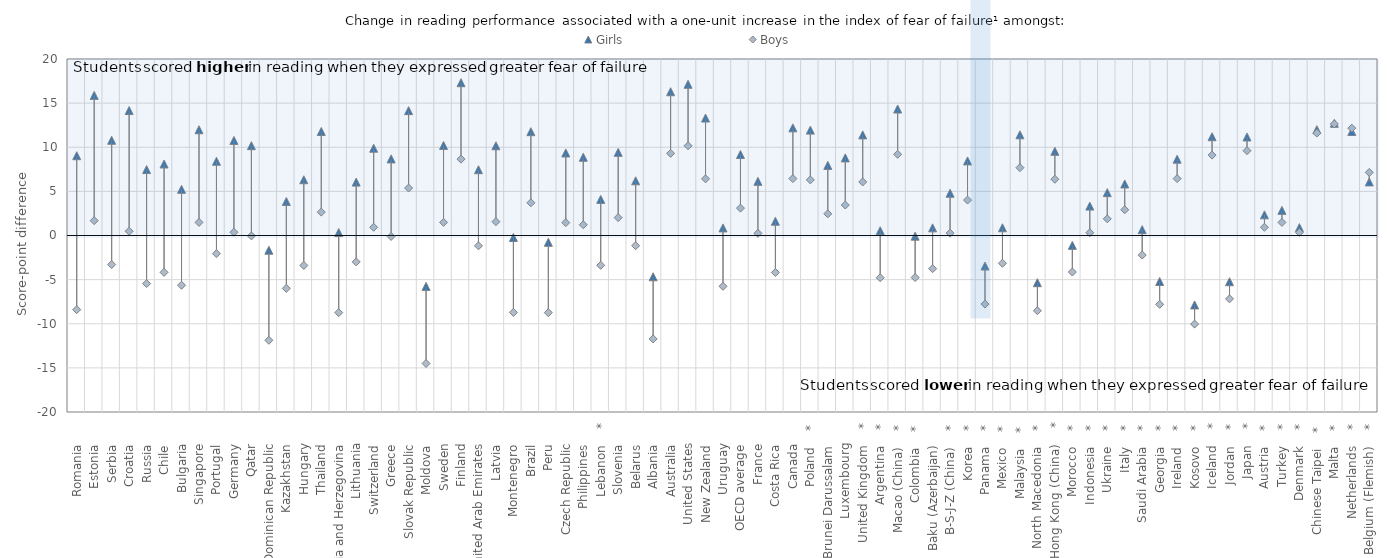
| Category | Girls | Boys |
|---|---|---|
| Romania      | 9.041 | -8.405 |
| Estonia      | 15.875 | 1.68 |
| Serbia      | 10.792 | -3.292 |
| Croatia      | 14.158 | 0.483 |
| Russia      | 7.47 | -5.446 |
| Chile      | 8.102 | -4.177 |
| Bulgaria      | 5.232 | -5.636 |
| Singapore      | 11.982 | 1.484 |
| Portugal      | 8.412 | -2.059 |
| Germany      | 10.769 | 0.37 |
| Qatar      | 10.178 | -0.046 |
| Dominican Republic      | -1.67 | -11.875 |
| Kazakhstan      | 3.853 | -5.993 |
| Hungary      | 6.318 | -3.395 |
| Thailand      | 11.784 | 2.65 |
| Bosnia and Herzegovina      | 0.333 | -8.736 |
| Lithuania      | 6.049 | -2.988 |
| Switzerland      | 9.891 | 0.931 |
| Greece      | 8.682 | -0.106 |
| Slovak Republic      | 14.147 | 5.376 |
| Moldova      | -5.77 | -14.505 |
| Sweden      | 10.205 | 1.488 |
| Finland      | 17.316 | 8.653 |
| United Arab Emirates      | 7.453 | -1.169 |
| Latvia      | 10.167 | 1.568 |
| Montenegro      | -0.226 | -8.717 |
| Brazil      | 11.765 | 3.705 |
| Peru      | -0.77 | -8.745 |
| Czech Republic      | 9.353 | 1.457 |
| Philippines      | 8.866 | 1.217 |
| Lebanon    * | 4.09 | -3.379 |
| Slovenia      | 9.423 | 2.025 |
| Belarus      | 6.197 | -1.154 |
| Albania      | -4.677 | -11.717 |
| Australia      | 16.29 | 9.308 |
| United States      | 17.137 | 10.169 |
| New Zealand      | 13.308 | 6.422 |
| Uruguay      | 0.86 | -5.756 |
| OECD average      | 9.175 | 3.103 |
| France      | 6.137 | 0.248 |
| Costa Rica      | 1.614 | -4.191 |
| Canada      | 12.196 | 6.447 |
| Poland    * | 11.942 | 6.305 |
| Brunei Darussalam      | 7.944 | 2.458 |
| Luxembourg      | 8.794 | 3.452 |
| United Kingdom    * | 11.399 | 6.069 |
| Argentina    * | 0.539 | -4.784 |
| Macao (China)    * | 14.33 | 9.199 |
| Colombia    * | -0.074 | -4.763 |
| Baku (Azerbaijan)      | 0.866 | -3.76 |
| B-S-J-Z (China)    * | 4.789 | 0.266 |
| Korea    * | 8.451 | 4.015 |
| Panama    * | -3.458 | -7.769 |
| Mexico    * | 0.875 | -3.15 |
| Malaysia    * | 11.41 | 7.687 |
| North Macedonia    * | -5.348 | -8.523 |
| Hong Kong (China)    * | 9.54 | 6.376 |
| Morocco    * | -1.118 | -4.139 |
| Indonesia    * | 3.332 | 0.31 |
| Ukraine    * | 4.853 | 1.887 |
| Italy    * | 5.84 | 2.915 |
| Saudi Arabia    * | 0.664 | -2.216 |
| Georgia    * | -5.214 | -7.799 |
| Ireland    * | 8.648 | 6.445 |
| Kosovo    * | -7.868 | -10.042 |
| Iceland    * | 11.193 | 9.11 |
| Jordan    * | -5.236 | -7.177 |
| Japan    * | 11.163 | 9.608 |
| Austria    * | 2.343 | 0.933 |
| Turkey    * | 2.85 | 1.482 |
| Denmark    * | 0.894 | 0.354 |
| Chinese Taipei    * | 11.994 | 11.603 |
| Malta    * | 12.715 | 12.639 |
| Netherlands    * | 11.784 | 12.161 |
| Belgium (Flemish)    * | 6.072 | 7.145 |